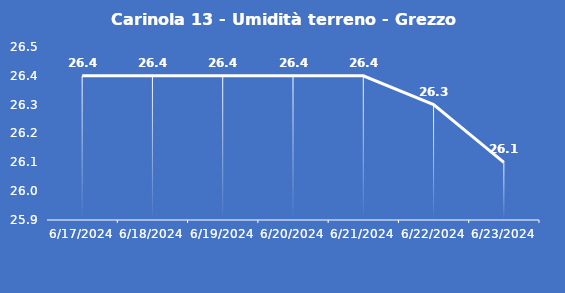
| Category | Carinola 13 - Umidità terreno - Grezzo (%VWC) |
|---|---|
| 6/17/24 | 26.4 |
| 6/18/24 | 26.4 |
| 6/19/24 | 26.4 |
| 6/20/24 | 26.4 |
| 6/21/24 | 26.4 |
| 6/22/24 | 26.3 |
| 6/23/24 | 26.1 |